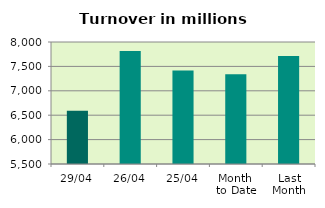
| Category | Series 0 |
|---|---|
| 29/04 | 6591.341 |
| 26/04 | 7816.954 |
| 25/04 | 7416.65 |
| Month 
to Date | 7337.351 |
| Last
Month | 7711.184 |